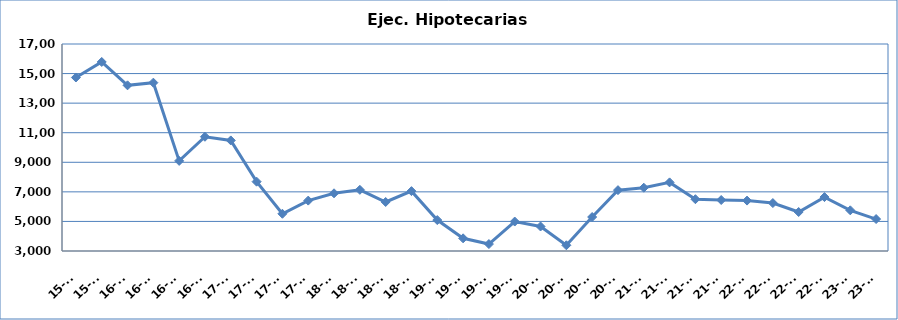
| Category | Ej. Hipotecarias |
|---|---|
| 15-T3 | 14735 |
| 15-T4 | 15785 |
| 16-T1 | 14205 |
| 16-T2 | 14385 |
| 16-T3 | 9094 |
| 16-T4 | 10726 |
| 17-T1 | 10478 |
| 17-T2 | 7689 |
| 17-T3 | 5518 |
| 17-T4 | 6409 |
| 18-T1 | 6903 |
| 18-T2 | 7137 |
| 18-T3 | 6315 |
| 18-T4 | 7049 |
| 19-T1 | 5092 |
| 19-T2 | 3857 |
| 19-T3 | 3470 |
| 19-T4 | 4992 |
| 20-T1 | 4658 |
| 20-T2 | 3387 |
| 20-T3 | 5299 |
| 20-T4 | 7116 |
| 21-T1 | 7280 |
| 21-T2 | 7641 |
| 21-T3 | 6504 |
| 21-T4 | 6449 |
| 22-T1 | 6410 |
| 22-T2 | 6242 |
| 22-T3 | 5637 |
| 22-T4 | 6646 |
| 23-T1 | 5751 |
| 23-T2 | 5161 |